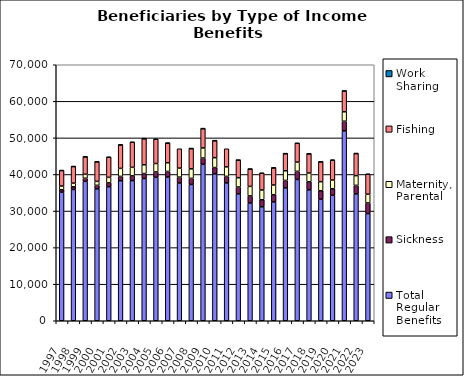
| Category | Total Regular Benefits | Sickness | Maternity, Parental | Fishing | Work Sharing |
|---|---|---|---|---|---|
| 1997.0 | 35155.833 | 667.5 | 1024 | 4229.167 | 48.333 |
| 1998.0 | 35893.333 | 741.667 | 989.833 | 4552.5 | 28.333 |
| 1999.0 | 38116.667 | 855.833 | 1076.167 | 4788.333 | 13.333 |
| 2000.0 | 36064.167 | 967.5 | 1082.5 | 5355 | 15 |
| 2001.0 | 36660 | 1046.667 | 1505 | 5495 | 29.167 |
| 2002.0 | 38281.667 | 1183.333 | 2200.833 | 6420.833 | 24.167 |
| 2003.0 | 38324.167 | 1295 | 2332.5 | 6860.833 | 10.833 |
| 2004.0 | 38890.833 | 1364.167 | 2395.833 | 7148.333 | 4.167 |
| 2005.0 | 39220.833 | 1465.833 | 2307.5 | 6630.833 | 5 |
| 2006.0 | 39297.5 | 1533.333 | 2379.167 | 5366.667 | 3.333 |
| 2007.0 | 37671.667 | 1601.667 | 2466.667 | 5298.333 | 0 |
| 2008.0 | 37265 | 1670 | 2605.833 | 5553.333 | 3.333 |
| 2009.0 | 42778.333 | 1714.167 | 2766.667 | 5282.5 | 9.167 |
| 2010.0 | 40182.5 | 1704.167 | 2702.5 | 4654.167 | 6.667 |
| 2011.0 | 37704.167 | 1765.833 | 2617.5 | 4935.833 | 0 |
| 2012.0 | 34701.667 | 1873.333 | 2540 | 4809.167 | 30 |
| 2013.0 | 32200.833 | 1935 | 2603.333 | 4743.333 | 0.833 |
| 2014.0 | 31175 | 1905.833 | 2680.833 | 4580 | 5 |
| 2015.0 | 32493.333 | 1978.333 | 2653.333 | 4677.5 | 10.833 |
| 2016.0 | 36343.333 | 2033.333 | 2630.833 | 4690 | 16.667 |
| 2017.0 | 38636.667 | 2216.667 | 2526.667 | 5144.167 | 17.5 |
| 2018.0 | 35808.333 | 2185.833 | 2404.167 | 5247.5 | 1.667 |
| 2019.0 | 33234.167 | 2316.667 | 2475.833 | 5445 | 1.667 |
| 2020.0 | 34322.5 | 1775.833 | 2380 | 5407.5 | 121.667 |
| 2021.0 | 51910.833 | 2652.5 | 2585 | 5687.5 | 43.333 |
| 2022.0 | 34707.5 | 2309.167 | 2661.667 | 6056.667 | 7.5 |
| 2023.0 | 29313.333 | 2901.667 | 2390 | 5461.667 | 3.333 |